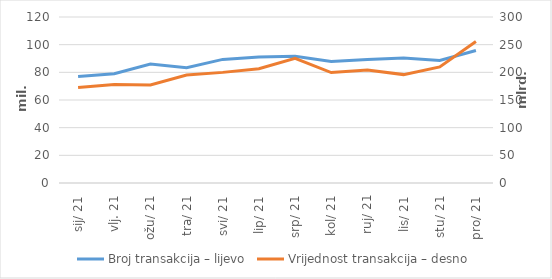
| Category | Broj transakcija – lijevo |
|---|---|
| sij. 21 | 77010690 |
| vlj. 21 | 78931977 |
| ožu. 21 | 85968718 |
| tra. 21 | 83362668 |
| svi. 21 | 89350925 |
| lip. 21 | 91130296 |
| srp. 21 | 91679956 |
| kol. 21 | 87868501 |
| ruj. 21 | 89277528 |
| lis. 21 | 90415693 |
| stu. 21 | 88536718 |
| pro. 21 | 95819366 |